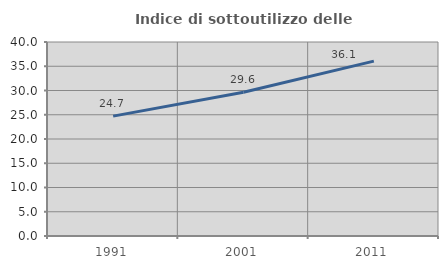
| Category | Indice di sottoutilizzo delle abitazioni  |
|---|---|
| 1991.0 | 24.721 |
| 2001.0 | 29.623 |
| 2011.0 | 36.053 |